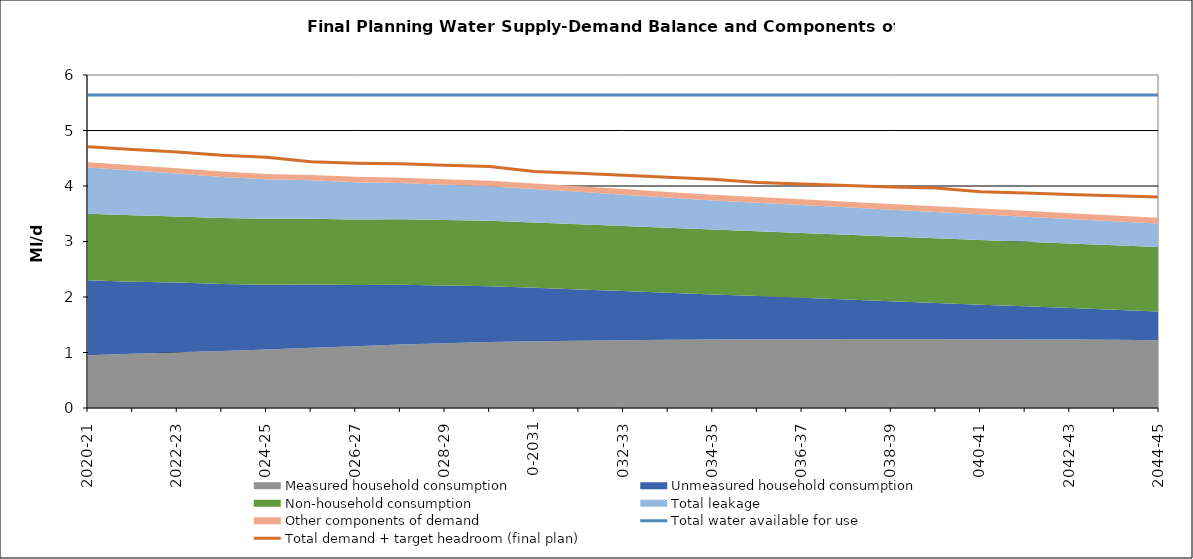
| Category | Total water available for use | Total demand + target headroom (final plan) |
|---|---|---|
| 0 | 5.639 | 4.708 |
| 1 | 5.639 | 4.658 |
| 2 | 5.639 | 4.613 |
| 3 | 5.639 | 4.553 |
| 4 | 5.639 | 4.516 |
| 5 | 5.639 | 4.437 |
| 6 | 5.639 | 4.411 |
| 7 | 5.639 | 4.399 |
| 8 | 5.639 | 4.375 |
| 9 | 5.639 | 4.35 |
| 10 | 5.639 | 4.261 |
| 11 | 5.639 | 4.228 |
| 12 | 5.639 | 4.194 |
| 13 | 5.639 | 4.157 |
| 14 | 5.639 | 4.124 |
| 15 | 5.639 | 4.061 |
| 16 | 5.639 | 4.035 |
| 17 | 5.639 | 4.011 |
| 18 | 5.639 | 3.984 |
| 19 | 5.639 | 3.962 |
| 20 | 5.639 | 3.895 |
| 21 | 5.639 | 3.875 |
| 22 | 5.639 | 3.848 |
| 23 | 5.639 | 3.826 |
| 24 | 5.639 | 3.801 |